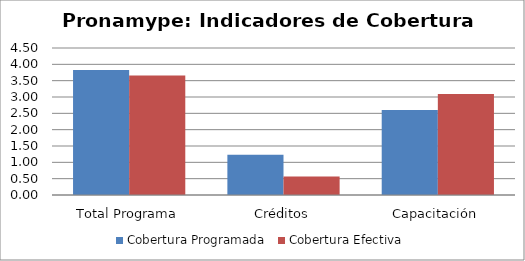
| Category | Cobertura Programada | Cobertura Efectiva |
|---|---|---|
| Total Programa | 3.83 | 3.658 |
| Créditos | 1.232 | 0.565 |
| Capacitación | 2.598 | 3.093 |